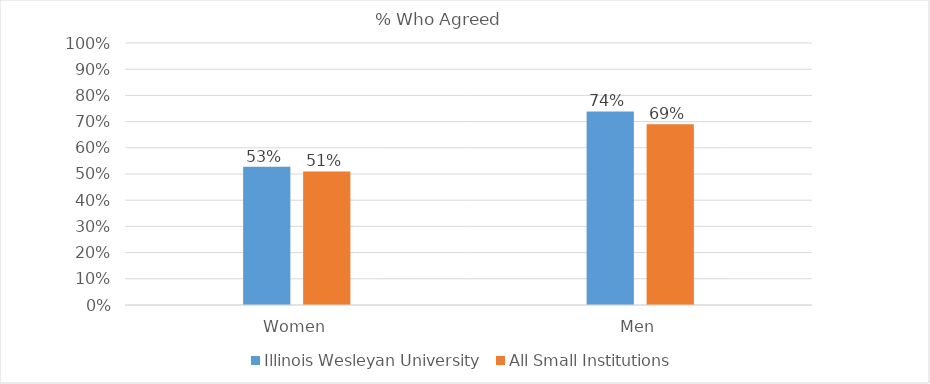
| Category | Illinois Wesleyan University | All Small Institutions |
|---|---|---|
| Women | 0.528 | 0.51 |
| Men | 0.739 | 0.69 |